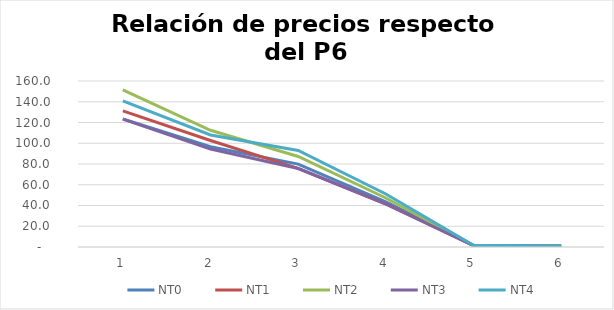
| Category | NT0 | NT1 | NT2 | NT3 | NT4 |
|---|---|---|---|---|---|
| 0 | 123.542 | 131.134 | 151.45 | 123.312 | 140.935 |
| 1 | 96.652 | 102.629 | 112.531 | 94.407 | 107.983 |
| 2 | 79.887 | 75.859 | 87.254 | 75.613 | 93.056 |
| 3 | 43.514 | 41.679 | 47.263 | 41.365 | 51.136 |
| 4 | 1.531 | 1.472 | 1.563 | 1.365 | 1.649 |
| 5 | 1 | 1 | 1 | 1 | 1 |